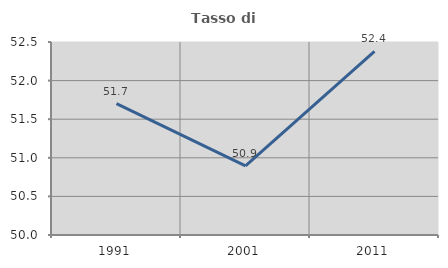
| Category | Tasso di occupazione   |
|---|---|
| 1991.0 | 51.701 |
| 2001.0 | 50.894 |
| 2011.0 | 52.378 |